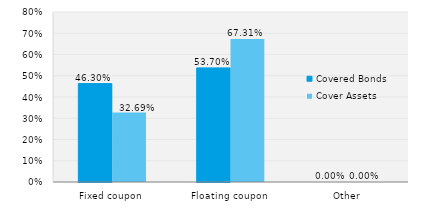
| Category | Covered Bonds | Cover Assets |
|---|---|---|
| Fixed coupon | 0.463 | 0.327 |
| Floating coupon | 0.537 | 0.673 |
| Other | 0 | 0 |